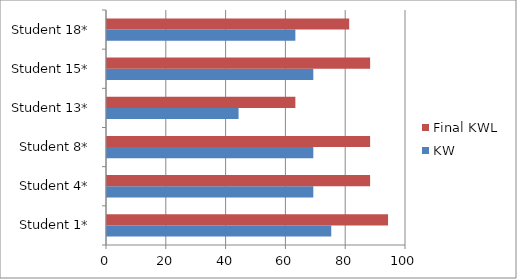
| Category | KW | Final KWL |
|---|---|---|
| Student 1* | 75 | 94 |
| Student 4* | 69 | 88 |
| Student 8* | 69 | 88 |
| Student 13* | 44 | 63 |
| Student 15* | 69 | 88 |
| Student 18* | 63 | 81 |